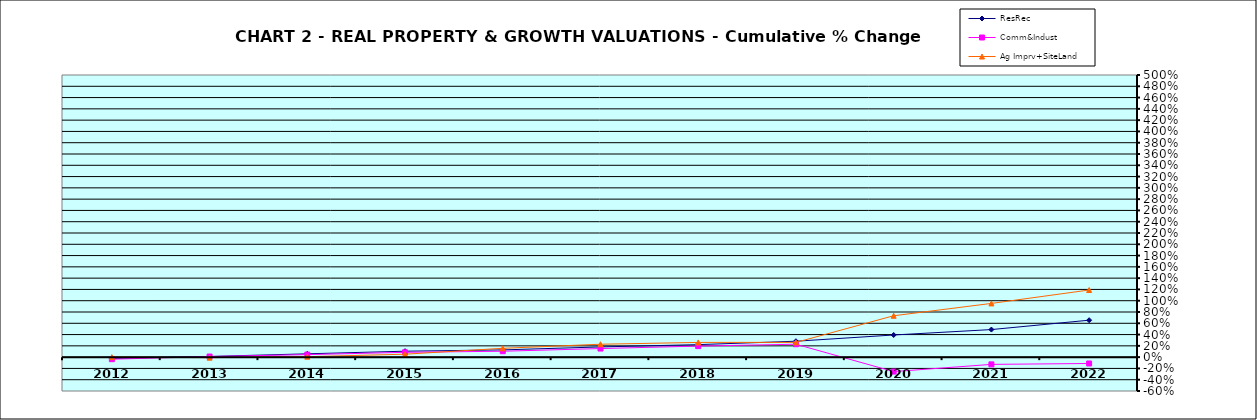
| Category | ResRec | Comm&Indust | Ag Imprv+SiteLand |
|---|---|---|---|
| 2012.0 | -0.021 | -0.036 | 0 |
| 2013.0 | 0.012 | 0.01 | -0.009 |
| 2014.0 | 0.059 | 0.045 | 0.008 |
| 2015.0 | 0.105 | 0.086 | 0.052 |
| 2016.0 | 0.128 | 0.105 | 0.157 |
| 2017.0 | 0.181 | 0.153 | 0.229 |
| 2018.0 | 0.222 | 0.196 | 0.261 |
| 2019.0 | 0.282 | 0.229 | 0.261 |
| 2020.0 | 0.393 | -0.256 | 0.733 |
| 2021.0 | 0.489 | -0.128 | 0.952 |
| 2022.0 | 0.655 | -0.112 | 1.19 |